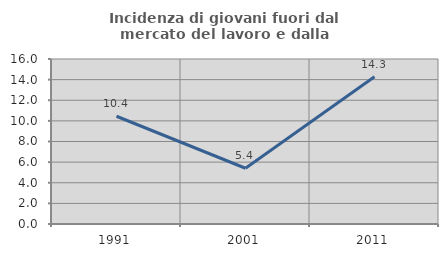
| Category | Incidenza di giovani fuori dal mercato del lavoro e dalla formazione  |
|---|---|
| 1991.0 | 10.448 |
| 2001.0 | 5.405 |
| 2011.0 | 14.286 |